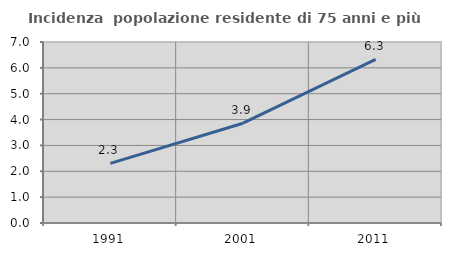
| Category | Incidenza  popolazione residente di 75 anni e più |
|---|---|
| 1991.0 | 2.304 |
| 2001.0 | 3.859 |
| 2011.0 | 6.325 |